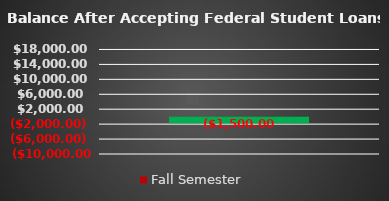
| Category | Fall Semester |
|---|---|
| Balance after Accepting Federal Student Loans | -1500 |